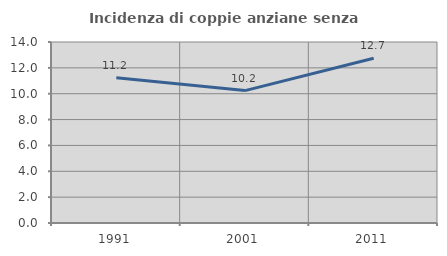
| Category | Incidenza di coppie anziane senza figli  |
|---|---|
| 1991.0 | 11.23 |
| 2001.0 | 10.241 |
| 2011.0 | 12.745 |